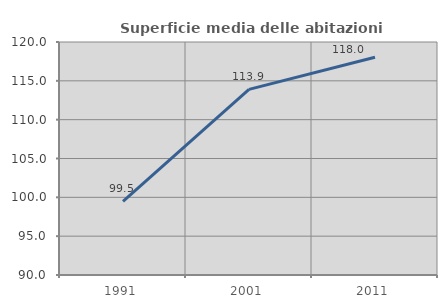
| Category | Superficie media delle abitazioni occupate |
|---|---|
| 1991.0 | 99.475 |
| 2001.0 | 113.897 |
| 2011.0 | 118.041 |